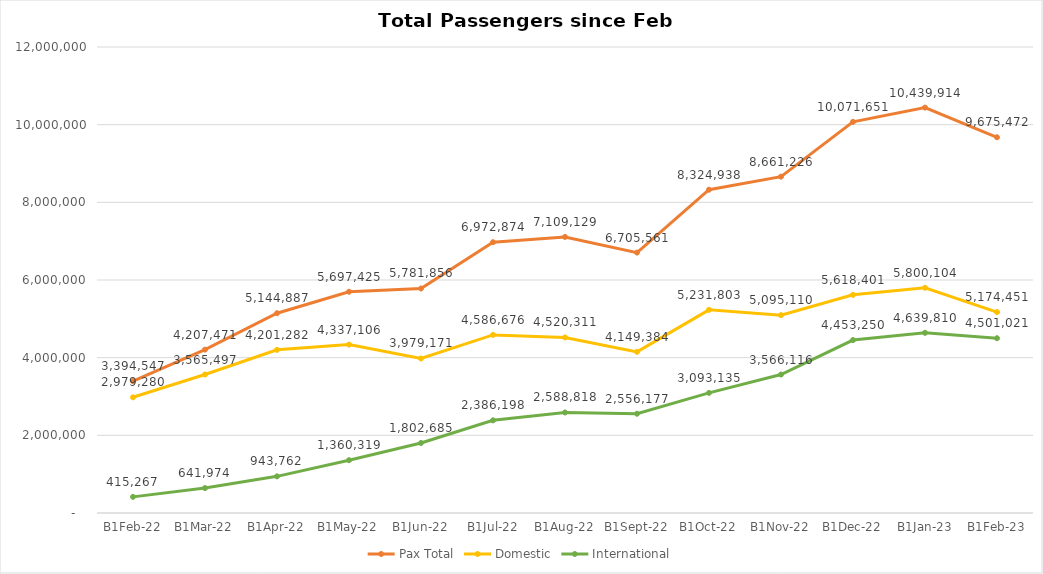
| Category | Pax Total |  Domestic  |  International  |
|---|---|---|---|
| 2022-02-01 | 3394547 | 2979280 | 415267 |
| 2022-03-01 | 4207471 | 3565497 | 641974 |
| 2022-04-01 | 5144887 | 4201282 | 943762 |
| 2022-05-01 | 5697425 | 4337106 | 1360319 |
| 2022-06-01 | 5781856 | 3979171 | 1802685 |
| 2022-07-01 | 6972874 | 4586676 | 2386198 |
| 2022-08-01 | 7109129 | 4520311 | 2588818 |
| 2022-09-01 | 6705561 | 4149384 | 2556177 |
| 2022-10-01 | 8324938 | 5231803 | 3093135 |
| 2022-11-01 | 8661226 | 5095110 | 3566116 |
| 2022-12-01 | 10071651 | 5618401 | 4453250 |
| 2023-01-01 | 10439914 | 5800104 | 4639810 |
| 2023-02-01 | 9675472 | 5174451 | 4501021 |